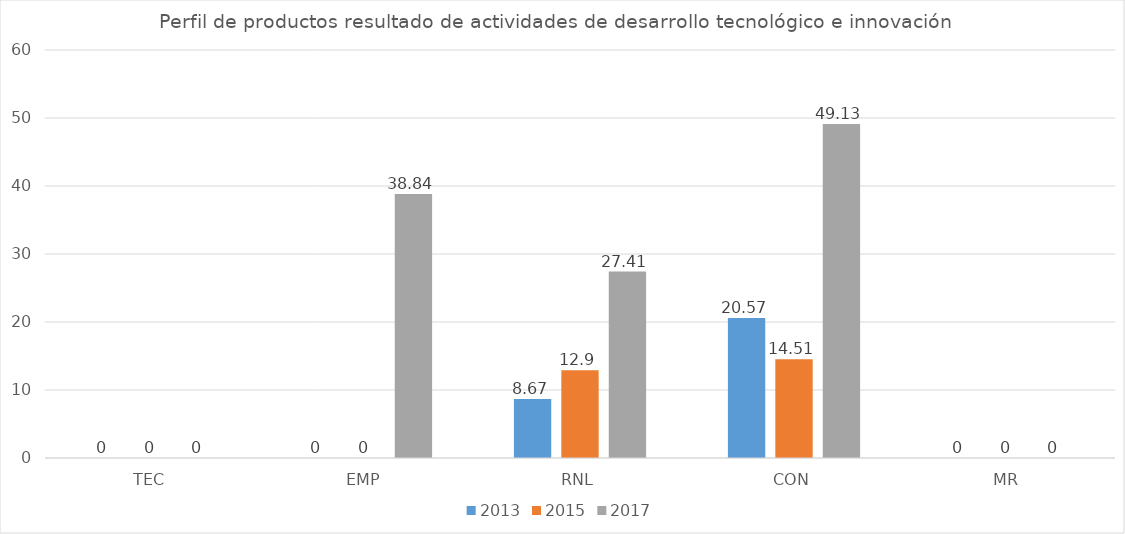
| Category | 2013 | 2015 | 2017 |
|---|---|---|---|
| TEC | 0 | 0 | 0 |
| EMP | 0 | 0 | 38.84 |
| RNL | 8.67 | 12.9 | 27.41 |
| CON | 20.57 | 14.51 | 49.13 |
| MR | 0 | 0 | 0 |